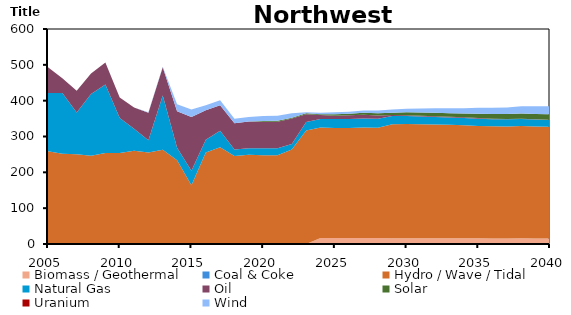
| Category | Biomass / Geothermal | Coal & Coke | Hydro / Wave / Tidal | Natural Gas | Oil | Solar | Uranium | Wind |
|---|---|---|---|---|---|---|---|---|
| 2005.0 | 0 | 0 | 259.107 | 162.401 | 71.627 | 0 | 0 | 0 |
| 2006.0 | 0 | 0 | 251.866 | 169.772 | 41.215 | 0 | 0 | 0 |
| 2007.0 | 0 | 0 | 250.246 | 116.923 | 60.645 | 0 | 0 | 0 |
| 2008.0 | 0 | 0 | 246.575 | 171.912 | 57.56 | 0 | 0 | 0 |
| 2009.0 | 0 | 0 | 253.952 | 191.497 | 61.1 | 0 | 0 | 0 |
| 2010.0 | 0 | 0 | 253.952 | 97.44 | 57.78 | 0 | 0 | 0 |
| 2011.0 | 0 | 0 | 260.345 | 61.318 | 59.13 | 0 | 0 | 0 |
| 2012.0 | 0 | 0 | 255.196 | 34.27 | 77.16 | 0 | 0 | 1.3 |
| 2013.0 | 0 | 0 | 262.758 | 151.62 | 78.73 | 0 | 0 | 1.6 |
| 2014.0 | 0 | 0 | 233.817 | 35 | 101.67 | 0 | 0 | 19.854 |
| 2015.0 | 0 | 0 | 163.837 | 40.6 | 149.87 | 0 | 0 | 20.782 |
| 2016.0 | 0 | 0 | 255.272 | 36 | 81.83 | 0 | 0 | 14.298 |
| 2017.0 | 0 | 0 | 270.289 | 45.927 | 71.21 | 0 | 0 | 14.066 |
| 2018.0 | 0 | 0 | 245.522 | 18.212 | 72.962 | 0.616 | 0 | 12.361 |
| 2019.0 | 0 | 0 | 249.114 | 18.317 | 74.109 | 0.625 | 0 | 12.541 |
| 2020.0 | 0 | 0 | 247.717 | 19.494 | 74.081 | 2.171 | 0 | 14.004 |
| 2021.0 | 0 | 0 | 247.731 | 19.483 | 74.252 | 2.172 | 0 | 14.004 |
| 2022.0 | 0 | 0 | 263.439 | 15.72 | 71.21 | 1.982 | 0 | 12.778 |
| 2023.0 | 0 | 0 | 317.036 | 23.669 | 21.642 | 2.444 | 0 | 2.936 |
| 2024.0 | 16.923 | 0 | 308.502 | 23.339 | 11.292 | 2.369 | 0 | 4.073 |
| 2025.0 | 16.823 | 0 | 306.942 | 25.091 | 9.343 | 4.037 | 0 | 5.316 |
| 2026.0 | 16.814 | 0 | 306.804 | 25.091 | 10.28 | 4.604 | 0 | 5.313 |
| 2027.0 | 16.936 | 0 | 308.299 | 25.091 | 10.41 | 5.194 | 0 | 6.707 |
| 2028.0 | 16.874 | 0 | 307.326 | 25.091 | 9.662 | 5.74 | 0 | 8.032 |
| 2029.0 | 16.041 | 0 | 318.451 | 22.84 | 2.797 | 5.998 | 0 | 8.919 |
| 2030.0 | 16.06 | 0 | 319.112 | 21.936 | 2.239 | 8.151 | 0 | 10.214 |
| 2031.0 | 16.007 | 0 | 318.218 | 21.452 | 2.386 | 8.667 | 0 | 11.461 |
| 2032.0 | 15.954 | 0 | 317.326 | 20.938 | 2.611 | 9.234 | 0 | 12.7 |
| 2033.0 | 15.907 | 0 | 316.537 | 20.38 | 2.287 | 9.804 | 0 | 13.934 |
| 2034.0 | 15.854 | 0 | 315.647 | 19.876 | 2.161 | 10.374 | 0 | 15.156 |
| 2035.0 | 15.741 | 0 | 313.681 | 20.368 | 1.539 | 12.48 | 0 | 16.308 |
| 2036.0 | 15.68 | 0 | 312.605 | 20.096 | 1.244 | 13.039 | 0 | 17.498 |
| 2037.0 | 15.656 | 0 | 312.294 | 19.894 | 1.012 | 13.633 | 0 | 18.725 |
| 2038.0 | 15.752 | 0 | 313.562 | 19.384 | 1.154 | 14.337 | 0 | 20.099 |
| 2039.0 | 15.689 | 0 | 312.48 | 19.02 | 0.917 | 14.906 | 0 | 21.274 |
| 2040.0 | 15.619 | 0 | 311.194 | 18.92 | 0.745 | 15.467 | 0 | 22.429 |